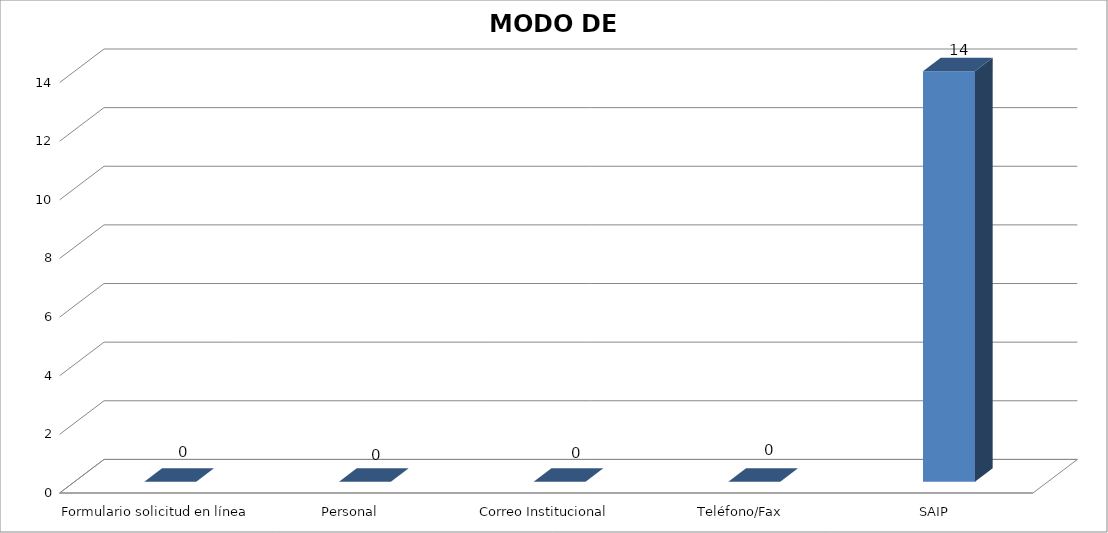
| Category | Series 0 | Series 1 | Series 2 |
|---|---|---|---|
| Formulario solicitud en línea |  | 0 |  |
| Personal |  | 0 |  |
| Correo Institucional |  | 0 |  |
| Teléfono/Fax |  | 0 |  |
| SAIP |  | 14 |  |